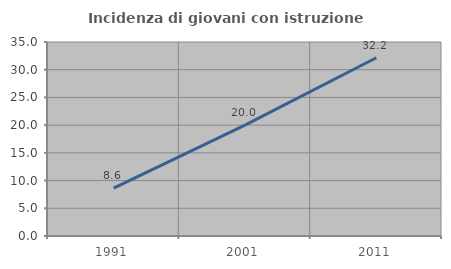
| Category | Incidenza di giovani con istruzione universitaria |
|---|---|
| 1991.0 | 8.636 |
| 2001.0 | 20 |
| 2011.0 | 32.163 |